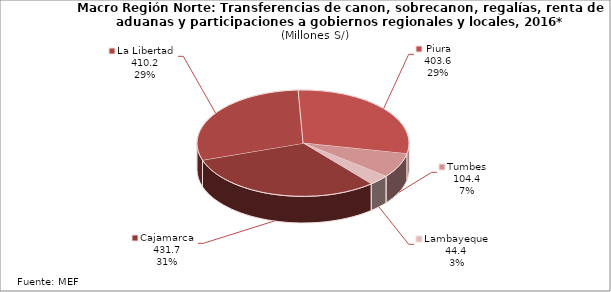
| Category | Series 1 |
|---|---|
| Cajamarca | 431.679 |
| La Libertad | 410.179 |
| Piura | 403.598 |
| Tumbes | 104.403 |
| Lambayeque | 44.437 |